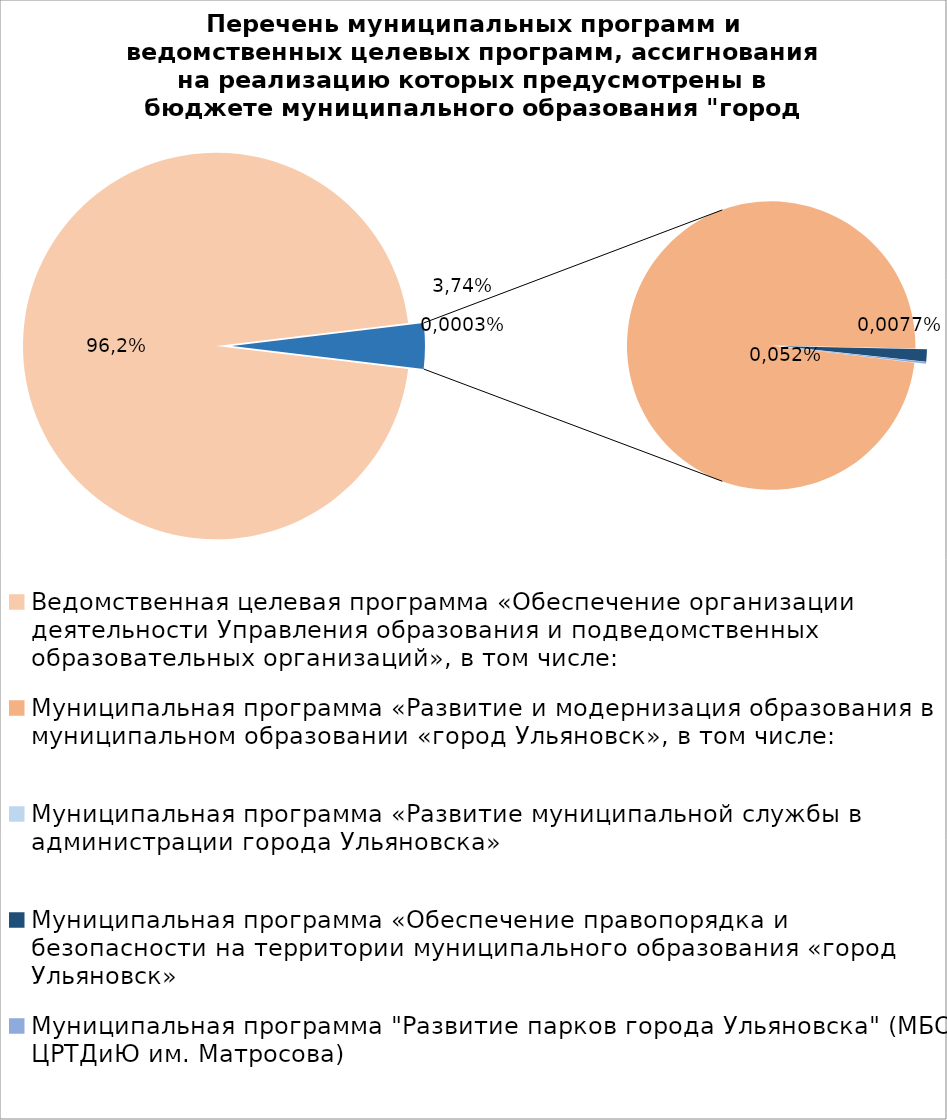
| Category | Series 0 |
|---|---|
| Ведомственная целевая программа «Обеспечение организации деятельности Управления образования и подведомственных образовательных организаций», в том числе: | 4973181.69 |
| Муниципальная программа «Развитие и модернизация образования в муниципальном образовании «город Ульяновск», в том числе: | 193308.55 |
| Муниципальная программа «Развитие муниципальной службы в администрации города Ульяновска» | 15.4 |
| Муниципальная программа «Обеспечение правопорядка и безопасности на территории муниципального образования «город Ульяновск» | 2700 |
| Муниципальная программа "Развитие парков города Ульяновска" (МБОУ ЦРТДиЮ им. Матросова) | 400 |